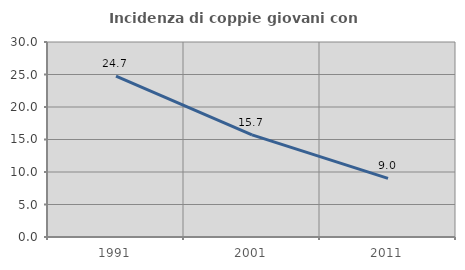
| Category | Incidenza di coppie giovani con figli |
|---|---|
| 1991.0 | 24.747 |
| 2001.0 | 15.717 |
| 2011.0 | 9.015 |